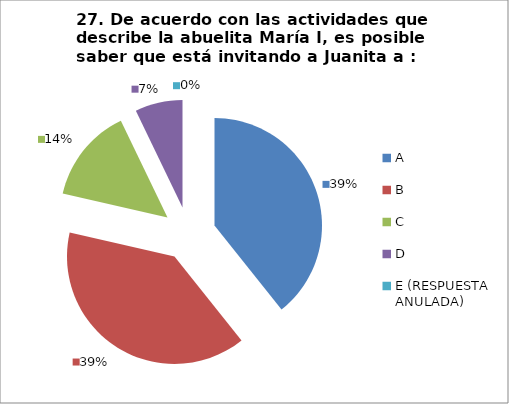
| Category | CANTIDAD DE RESPUESTAS PREGUNTA (23) | PORCENTAJE |
|---|---|---|
| A | 11 | 0.393 |
| B | 11 | 0.393 |
| C | 4 | 0.143 |
| D | 2 | 0.071 |
| E (RESPUESTA ANULADA) | 0 | 0 |